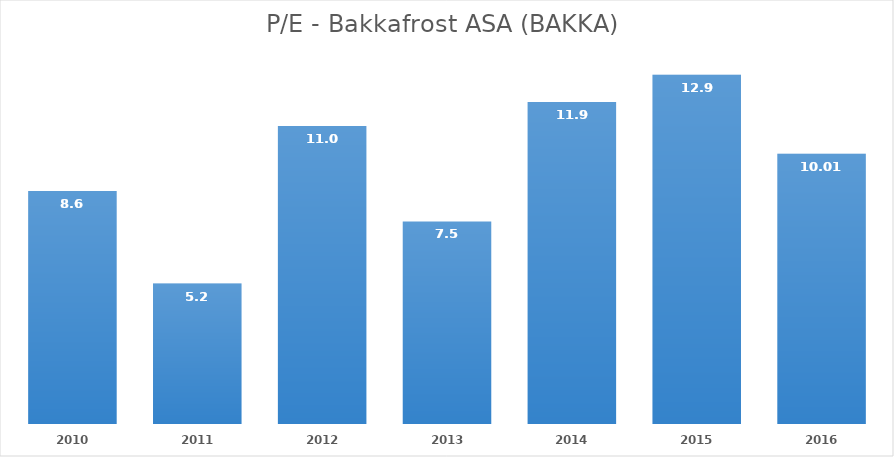
| Category | Series 0 |
|---|---|
| 2010.0 | 8.627 |
| 2011.0 | 5.2 |
| 2012.0 | 11.035 |
| 2013.0 | 7.504 |
| 2014.0 | 11.926 |
| 2015.0 | 12.936 |
| 2016.0 | 10.013 |